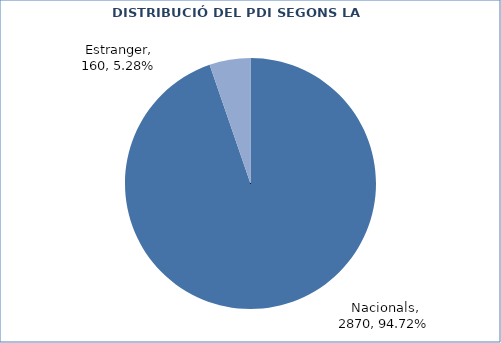
| Category | Series 0 |
|---|---|
| Nacionals | 2870 |
| Estranger | 160 |